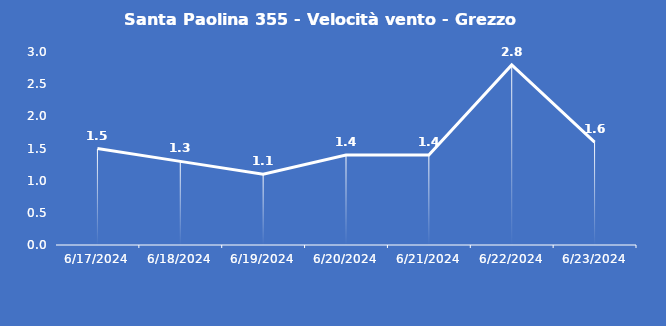
| Category | Santa Paolina 355 - Velocità vento - Grezzo (m/s) |
|---|---|
| 6/17/24 | 1.5 |
| 6/18/24 | 1.3 |
| 6/19/24 | 1.1 |
| 6/20/24 | 1.4 |
| 6/21/24 | 1.4 |
| 6/22/24 | 2.8 |
| 6/23/24 | 1.6 |